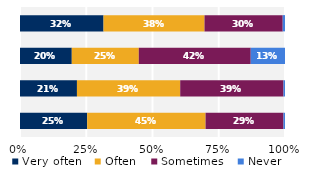
| Category | Very often | Often | Sometimes | Never |
|---|---|---|---|---|
| Talked about students' career plans | 0.315 | 0.381 | 0.295 | 0.009 |
| Worked on activities other than 
coursework | 0.195 | 0.253 | 0.422 | 0.129 |
| Discussed course topics, ideas, or concepts 
outside of class | 0.215 | 0.39 | 0.39 | 0.006 |
| Discussed students' academic performance | 0.254 | 0.447 | 0.294 | 0.006 |